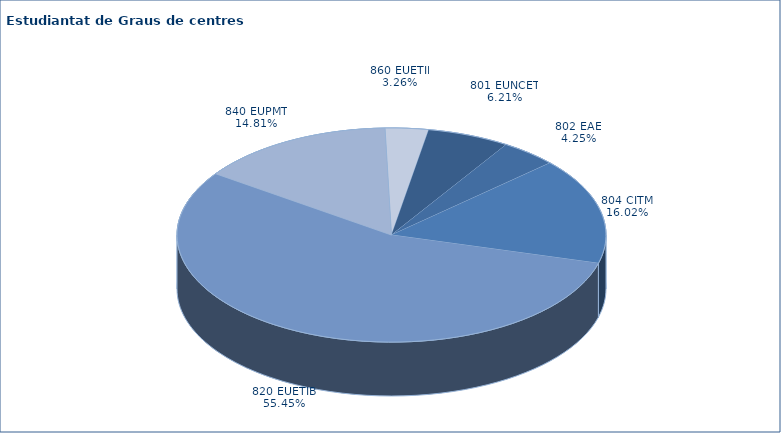
| Category | Series 0 |
|---|---|
| 801 EUNCET | 181 |
| 802 EAE | 124 |
| 804 CITM | 467 |
| 820 EUETIB | 1617 |
| 840 EUPMT | 432 |
| 860 EUETII | 95 |